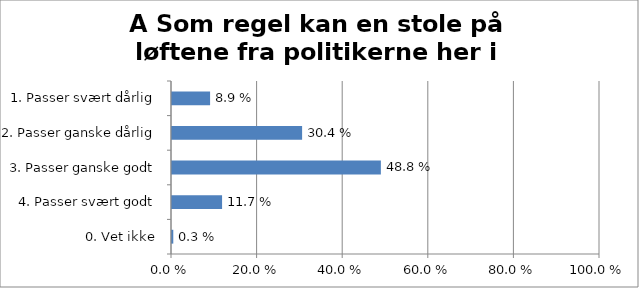
| Category | A Som regel kan en stole på løftene fra politikerne her i kommunen |
|---|---|
| 1. Passer svært dårlig | 0.089 |
| 2. Passer ganske dårlig | 0.304 |
| 3. Passer ganske godt | 0.488 |
| 4. Passer svært godt | 0.117 |
| 0. Vet ikke | 0.003 |